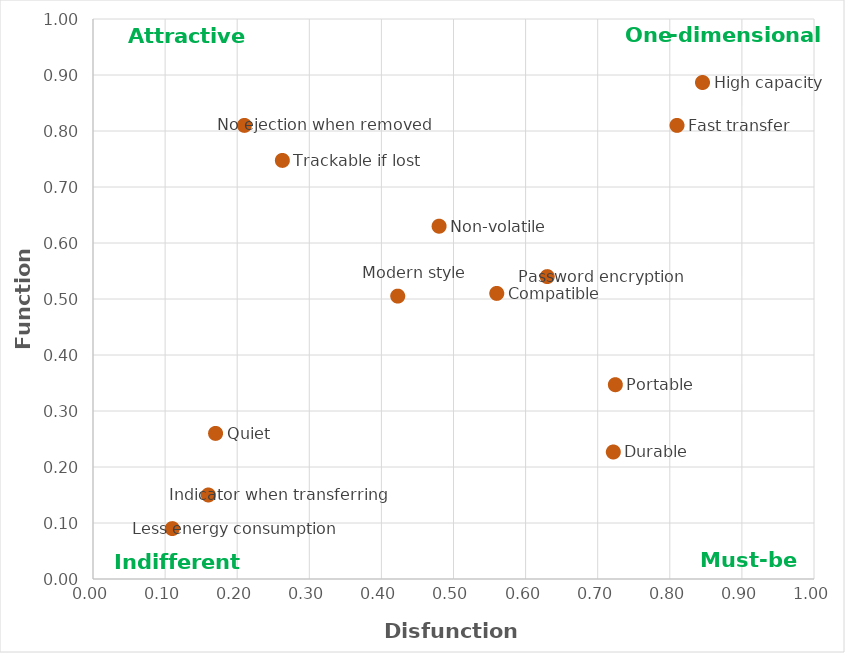
| Category | DS |
|---|---|
| 0.81 | 0.81 |
| 0.7216494845360825 | 0.227 |
| 0.7244897959183674 | 0.347 |
| 0.845360824742268 | 0.887 |
| 0.56 | 0.51 |
| 0.17 | 0.26 |
| 0.422680412371134 | 0.505 |
| 0.63 | 0.54 |
| 0.48 | 0.63 |
| 0.11 | 0.09 |
| 0.16 | 0.15 |
| 0.21 | 0.81 |
| 0.26262626262626265 | 0.747 |